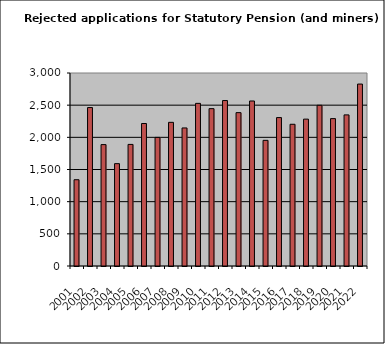
| Category | Series 0 |
|---|---|
| 2001.0 | 1341 |
| 2002.0 | 2463 |
| 2003.0 | 1887 |
| 2004.0 | 1591 |
| 2005.0 | 1890 |
| 2006.0 | 2215 |
| 2007.0 | 1999 |
| 2008.0 | 2233 |
| 2009.0 | 2146 |
| 2010.0 | 2528 |
| 2011.0 | 2446 |
| 2012.0 | 2572 |
| 2013.0 | 2384 |
| 2014.0 | 2565 |
| 2015.0 | 1953 |
| 2016.0 | 2307 |
| 2017.0 | 2203 |
| 2018.0 | 2283 |
| 2019.0 | 2498 |
| 2020.0 | 2291 |
| 2021.0 | 2349 |
| 2022.0 | 2828 |